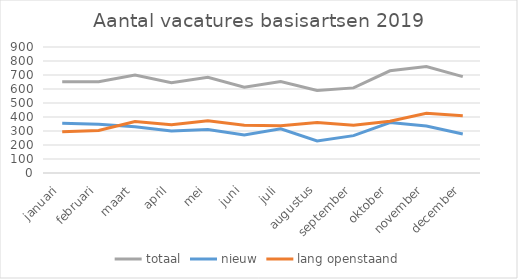
| Category | totaal | nieuw | lang openstaand |
|---|---|---|---|
| januari | 651 | 356 | 295 |
| februari | 652 | 348 | 304 |
| maart | 699 | 331 | 368 |
| april | 645 | 300 | 345 |
| mei | 683 | 310 | 373 |
| juni | 613 | 272 | 341 |
| juli | 653 | 316 | 337 |
| augustus | 590 | 229 | 361 |
| september | 608 | 267 | 341 |
| oktober | 730 | 360 | 370 |
| november | 761 | 335 | 426 |
| december | 688 | 279 | 409 |